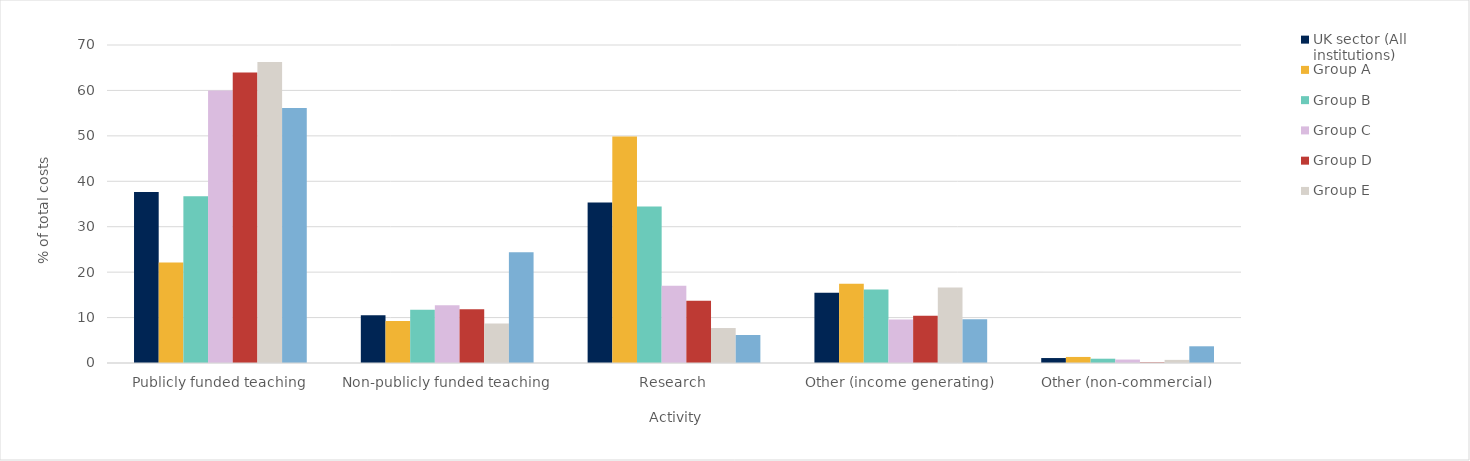
| Category | UK sector (All institutions) | Group A | Group B | Group C | Group D | Group E | Group F |
|---|---|---|---|---|---|---|---|
| 0 | 37.615 | 22.117 | 36.711 | 59.964 | 63.928 | 66.271 | 56.157 |
| 1 | 10.503 | 9.24 | 11.696 | 12.687 | 11.849 | 8.712 | 24.368 |
| 2 | 35.305 | 49.84 | 34.446 | 17.024 | 13.676 | 7.696 | 6.16 |
| 3 | 15.485 | 17.47 | 16.203 | 9.567 | 10.427 | 16.636 | 9.636 |
| 4 | 1.091 | 1.332 | 0.945 | 0.757 | 0.119 | 0.685 | 3.679 |